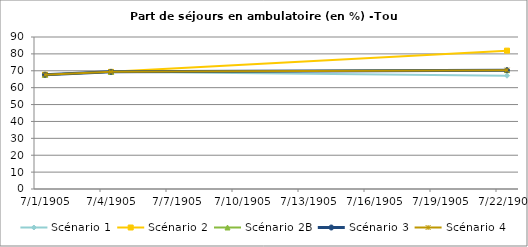
| Category | Scénario 1 | Scénario 2 | Scénario 2B | Scénario 3 | Scénario 4 |
|---|---|---|---|---|---|
| 2009.0 | 67.661 | 67.661 | 67.661 | 67.661 | 67.661 |
| 2012.0 | 69.365 | 69.365 | 69.365 | 69.365 | 69.365 |
| 2030.0 | 67.067 | 81.927 | 70.353 | 70.353 | 70.353 |